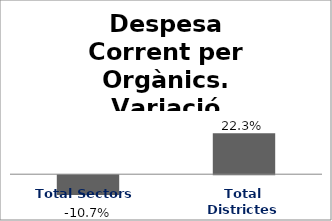
| Category | Series 0 |
|---|---|
| Total Sectors | -0.107 |
| Total Districtes | 0.223 |